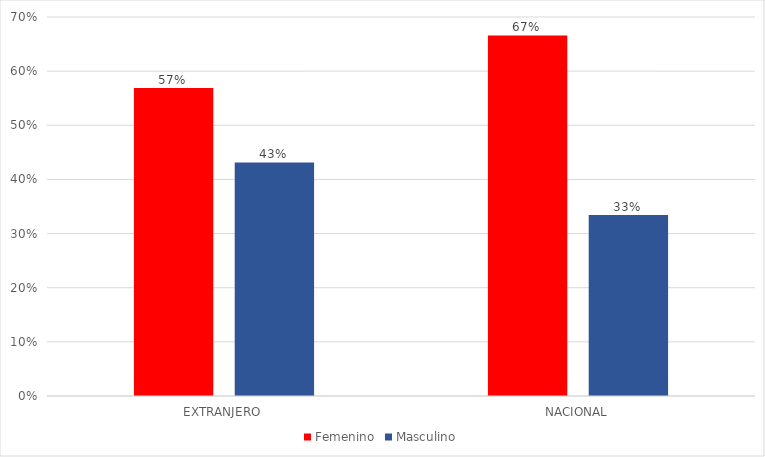
| Category | Femenino | Masculino |
|---|---|---|
| EXTRANJERO | 0.569 | 0.431 |
| NACIONAL | 0.666 | 0.334 |